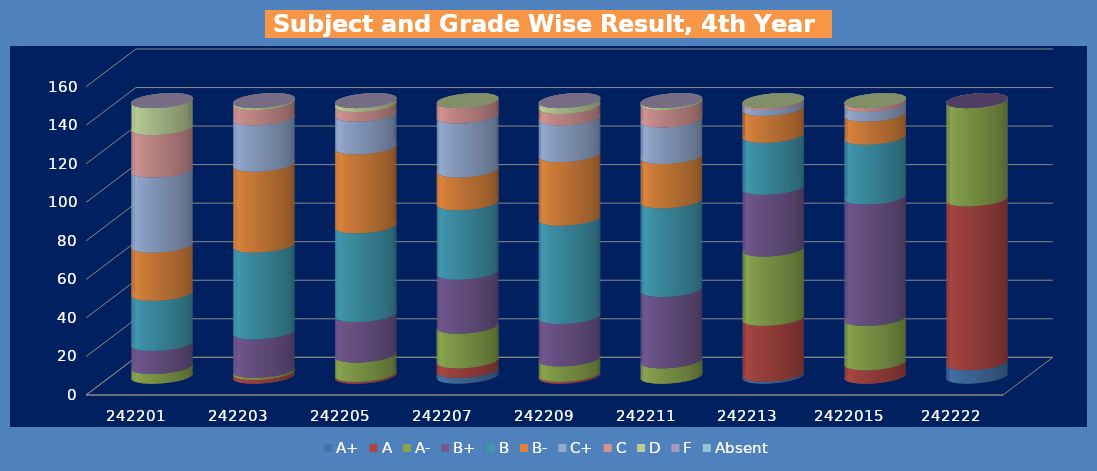
| Category | A+ | A | A- | B+ | B | B- | C+ | C | D | F | Absent |
|---|---|---|---|---|---|---|---|---|---|---|---|
| 242201.0 | 0 | 0 | 5 | 12 | 26 | 25 | 39 | 22 | 14 | 0 | 0 |
| 242203.0 | 0 | 2 | 1 | 20 | 45 | 42 | 24 | 8 | 1 | 0 | 0 |
| 242205.0 | 0 | 1 | 10 | 21 | 46 | 41 | 17 | 5 | 2 | 0 | 0 |
| 242207.0 | 3 | 5 | 18 | 28 | 36 | 17 | 28 | 8 | 0 | 0 | 0 |
| 242209.0 | 0 | 1 | 8 | 22 | 51 | 33 | 19 | 6 | 3 | 0 | 0 |
| 242211.0 | 0 | 0 | 8 | 37 | 46 | 23 | 19 | 9 | 1 | 0 | 0 |
| 242213.0 | 1 | 29 | 36 | 32 | 27 | 14 | 3 | 1 | 0 | 0 | 0 |
| 2422015.0 | 0 | 7 | 23 | 63 | 31 | 12 | 5 | 2 | 0 | 0 | 0 |
| 242222.0 | 7 | 85 | 51 | 0 | 0 | 0 | 0 | 0 | 0 | 0 | 0 |